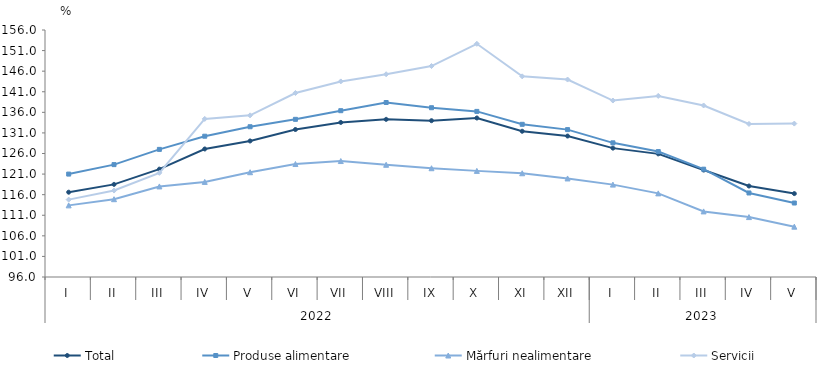
| Category | Total  | Produse alimentare | Mărfuri nealimentare  | Servicii |
|---|---|---|---|---|
| 0 | 116.6 | 121 | 113.4 | 114.8 |
| 1 | 118.5 | 123.3 | 114.9 | 117 |
| 2 | 122.2 | 127 | 118 | 121.3 |
| 3 | 127.1 | 130.2 | 119.1 | 134.4 |
| 4 | 129.047 | 132.5 | 121.45 | 135.267 |
| 5 | 131.827 | 134.301 | 123.443 | 140.701 |
| 6 | 133.547 | 136.399 | 124.168 | 143.511 |
| 7 | 134.294 | 138.387 | 123.256 | 145.253 |
| 8 | 133.971 | 137.121 | 122.424 | 147.248 |
| 9 | 134.625 | 136.226 | 121.779 | 152.646 |
| 10 | 131.406 | 133.093 | 121.201 | 144.742 |
| 11 | 130.241 | 131.801 | 119.936 | 143.965 |
| 12 | 127.307 | 128.59 | 118.441 | 138.865 |
| 13 | 125.91 | 126.47 | 116.31 | 139.99 |
| 14 | 121.977 | 122.19 | 111.932 | 137.666 |
| 15 | 118.102 | 116.414 | 110.554 | 133.178 |
| 16 | 116.262 | 113.97 | 108.228 | 133.268 |